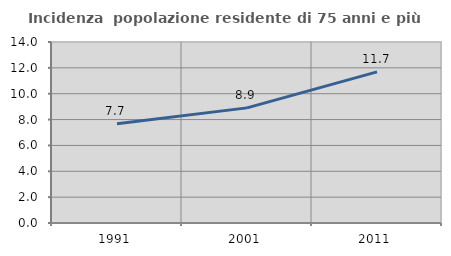
| Category | Incidenza  popolazione residente di 75 anni e più |
|---|---|
| 1991.0 | 7.684 |
| 2001.0 | 8.904 |
| 2011.0 | 11.688 |